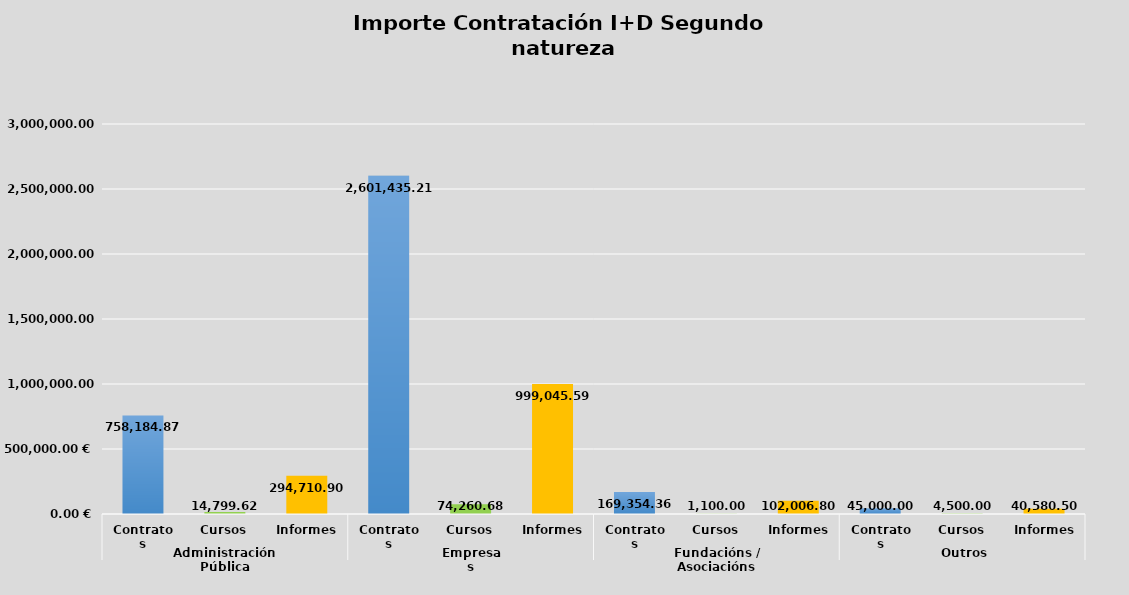
| Category | Series 0 |
|---|---|
| 0 | 758184.87 |
| 1 | 14799.62 |
| 2 | 294710.9 |
| 3 | 2601435.21 |
| 4 | 74260.68 |
| 5 | 999045.59 |
| 6 | 169354.36 |
| 7 | 1100 |
| 8 | 102006.8 |
| 9 | 45000 |
| 10 | 4500 |
| 11 | 40580.5 |